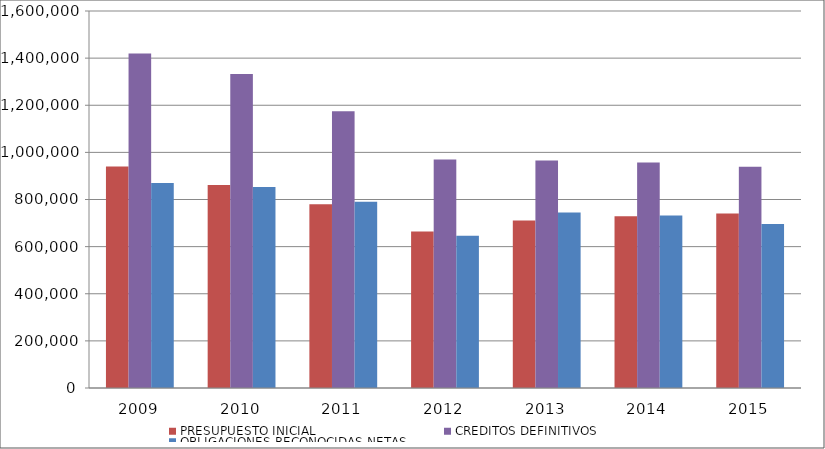
| Category | PRESUPUESTO INICIAL | CREDITOS DEFINITIVOS | OBLIGACIONES RECONOCIDAS NETAS |
|---|---|---|---|
| 2009.0 | 939676.058 | 1419362.4 | 870419.19 |
| 2010.0 | 861041.347 | 1333148.83 | 853013.717 |
| 2011.0 | 780284.157 | 1174051.878 | 790656.119 |
| 2012.0 | 663839.162 | 969231.971 | 646103.913 |
| 2013.0 | 710893.242 | 965003.591 | 744398.393 |
| 2014.0 | 728748.257 | 956965.337 | 731935.083 |
| 2015.0 | 740573.085 | 939366.111 | 695990.213 |